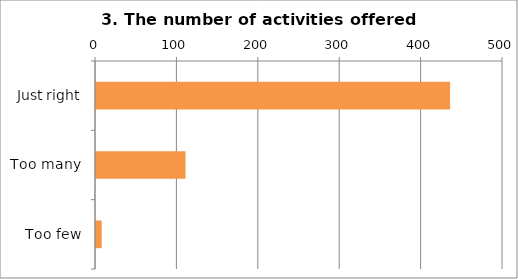
| Category | 3. The number of activities offered was . . . |
|---|---|
| Just right | 435 |
| Too many | 110 |
| Too few | 7 |